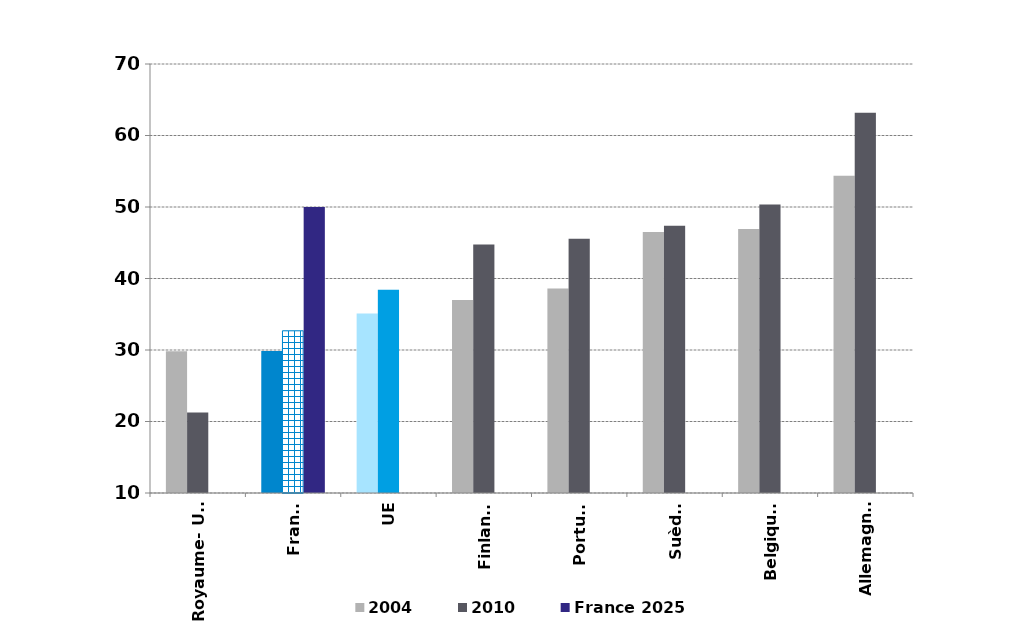
| Category | 2004 | 2010 | France 2025 |
|---|---|---|---|
| Royaume- Uni  | 29.823 | 21.258 | 0 |
| France | 29.861 | 32.681 | 50 |
| UE | 35.117 | 38.442 | 0 |
| Finlande | 37.002 | 44.752 | 0 |
| Portugal | 38.617 | 45.573 | 0 |
| Suède  | 46.499 | 47.382 | 0 |
| Belgique  | 46.921 | 50.343 | 0 |
| Allemagne  | 54.368 | 63.191 | 0 |